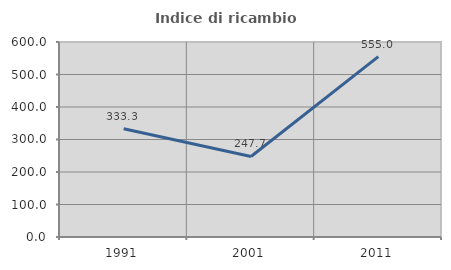
| Category | Indice di ricambio occupazionale  |
|---|---|
| 1991.0 | 333.333 |
| 2001.0 | 247.727 |
| 2011.0 | 555 |